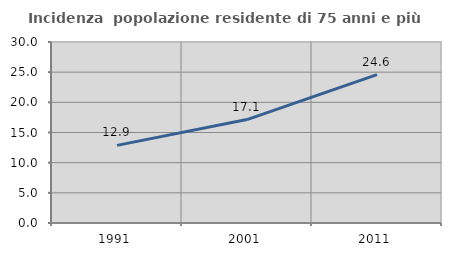
| Category | Incidenza  popolazione residente di 75 anni e più |
|---|---|
| 1991.0 | 12.867 |
| 2001.0 | 17.14 |
| 2011.0 | 24.603 |